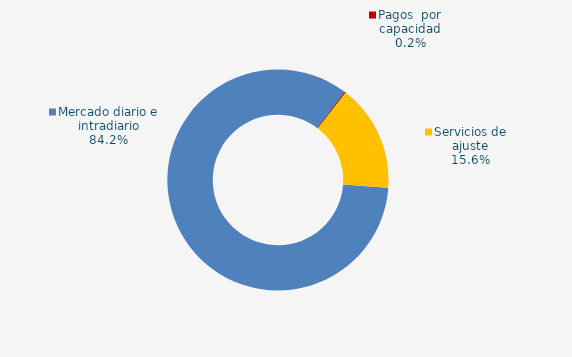
| Category | Series 0 |
|---|---|
| Mercado diario e intradiario | 74.42 |
| Pagos  por capacidad | 0.17 |
| Mecanismo ajuste RD-L 10/2022 | 0 |
| Servicios de ajuste | 13.82 |